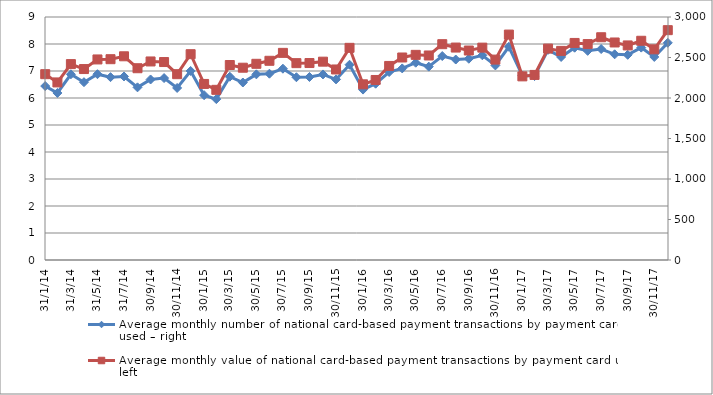
| Category | Average monthly number of national card-based payment transactions by payment card used – right |
|---|---|
| 2014-01-31 | 6.443 |
| 2014-02-28 | 6.186 |
| 2014-03-31 | 6.878 |
| 2014-04-30 | 6.586 |
| 2014-05-31 | 6.882 |
| 2014-06-30 | 6.772 |
| 2014-07-31 | 6.798 |
| 2014-08-31 | 6.395 |
| 2014-09-30 | 6.686 |
| 2014-10-31 | 6.738 |
| 2014-11-30 | 6.373 |
| 2014-12-31 | 7.002 |
| 2015-01-31 | 6.104 |
| 2015-02-28 | 5.958 |
| 2015-03-31 | 6.788 |
| 2015-04-30 | 6.574 |
| 2015-05-31 | 6.876 |
| 2015-06-30 | 6.9 |
| 2015-07-31 | 7.085 |
| 2015-08-31 | 6.769 |
| 2015-09-30 | 6.778 |
| 2015-10-31 | 6.872 |
| 2015-11-30 | 6.689 |
| 2015-12-31 | 7.232 |
| 2016-01-31 | 6.312 |
| 2016-02-29 | 6.53 |
| 2016-03-31 | 6.962 |
| 2016-04-30 | 7.096 |
| 2016-05-31 | 7.307 |
| 2016-06-30 | 7.161 |
| 2016-07-31 | 7.554 |
| 2016-08-31 | 7.425 |
| 2016-09-30 | 7.454 |
| 2016-10-31 | 7.583 |
| 2016-11-30 | 7.206 |
| 2016-12-31 | 7.898 |
| 2017-01-31 | 6.83 |
| 2017-02-28 | 6.812 |
| 2017-03-31 | 7.784 |
| 2017-04-30 | 7.52 |
| 2017-05-31 | 7.863 |
| 2017-06-30 | 7.746 |
| 2017-07-31 | 7.813 |
| 2017-08-31 | 7.618 |
| 2017-09-30 | 7.6 |
| 2017-10-31 | 7.866 |
| 2017-11-30 | 7.52 |
| 2017-12-31 | 8.044 |